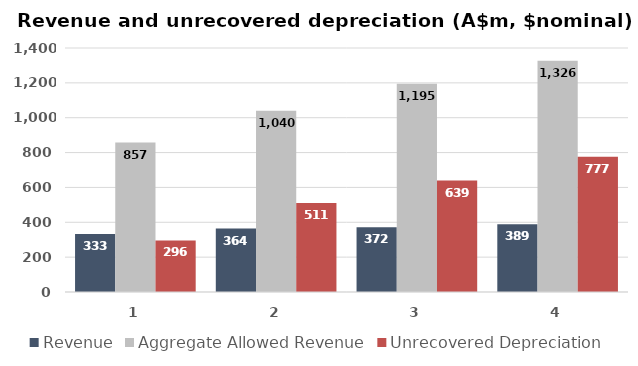
| Category | Revenue | Aggregate Allowed Revenue | Unrecovered Depreciation |
|---|---|---|---|
| 2017.0 | 333.064 | 857.089 | 295.734 |
| 2018.0 | 364.057 | 1039.581 | 510.863 |
| 2019.0 | 371.84 | 1194.783 | 639.199 |
| 2020.0 | 388.635 | 1326.31 | 776.596 |